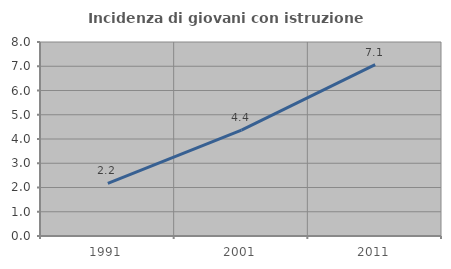
| Category | Incidenza di giovani con istruzione universitaria |
|---|---|
| 1991.0 | 2.174 |
| 2001.0 | 4.367 |
| 2011.0 | 7.071 |